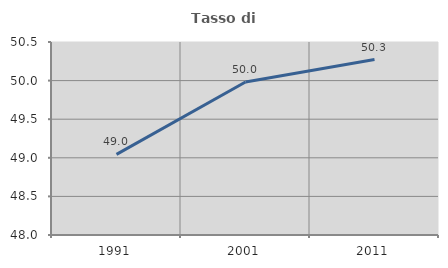
| Category | Tasso di occupazione   |
|---|---|
| 1991.0 | 49.044 |
| 2001.0 | 49.983 |
| 2011.0 | 50.273 |